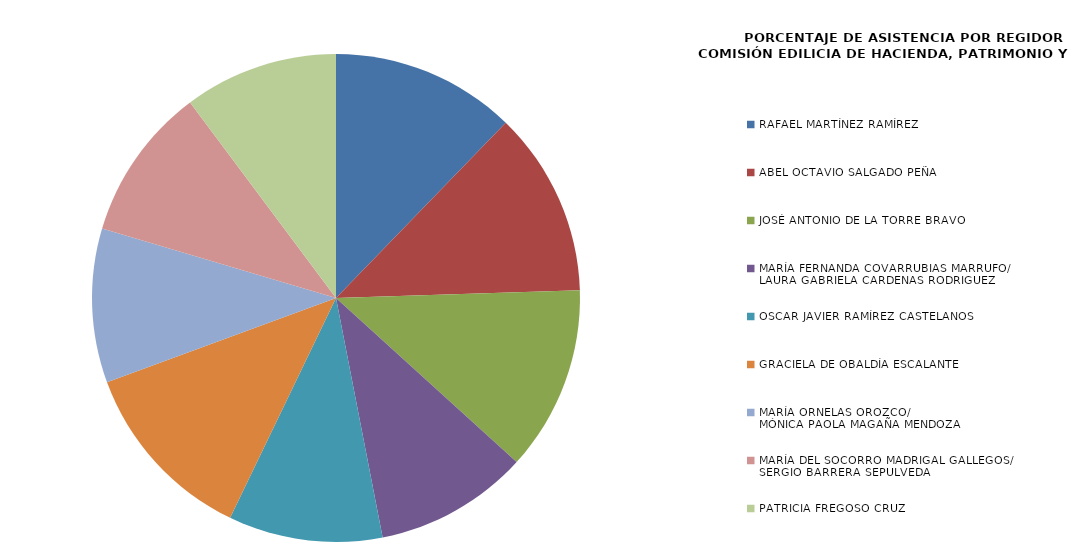
| Category | Series 0 |
|---|---|
| RAFAEL MARTÍNEZ RAMÍREZ | 100 |
| ABEL OCTAVIO SALGADO PEÑA  | 100 |
| JOSÉ ANTONIO DE LA TORRE BRAVO | 100 |
| MARÍA FERNANDA COVARRUBIAS MARRUFO/
LAURA GABRIELA CARDENAS RODRIGUEZ | 83.333 |
| OSCAR JAVIER RAMÍREZ CASTELANOS | 83.333 |
| GRACIELA DE OBALDÍA ESCALANTE | 100 |
| MARÍA ORNELAS OROZCO/
MÓNICA PAOLA MAGAÑA MENDOZA | 83.333 |
| MARÍA DEL SOCORRO MADRIGAL GALLEGOS/
SERGIO BARRERA SEPULVEDA | 83.333 |
| PATRICIA FREGOSO CRUZ | 83.333 |